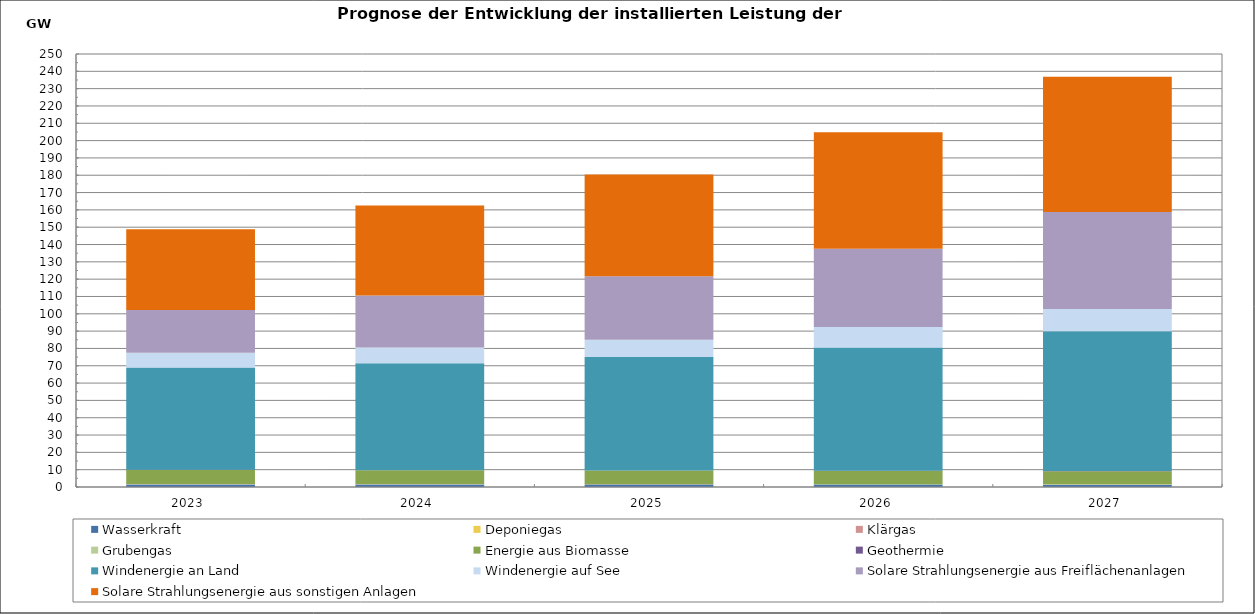
| Category | Wasserkraft | Deponiegas | Klärgas | Grubengas | Energie aus Biomasse | Geothermie | Windenergie an Land | Windenergie auf See | Solare Strahlungsenergie aus Freiflächenanlagen | Solare Strahlungsenergie aus sonstigen Anlagen |
|---|---|---|---|---|---|---|---|---|---|---|
| 2023.0 | 1424.26 | 79.153 | 66.397 | 133.631 | 8157.264 | 58.252 | 59010.05 | 8625.818 | 24583.586 | 46656.818 |
| 2024.0 | 1410.662 | 77.402 | 66.997 | 125.491 | 7979.979 | 70.252 | 61745.439 | 9093.818 | 29953.874 | 51990.753 |
| 2025.0 | 1395.865 | 73.826 | 67.397 | 118.701 | 7801.287 | 82.252 | 65488.589 | 9993.818 | 36670.302 | 58751.541 |
| 2026.0 | 1381.897 | 60.764 | 67.997 | 116.001 | 7620.241 | 94.252 | 71160.78 | 11851.818 | 45229.405 | 67297.146 |
| 2027.0 | 1367.628 | 58.962 | 68.397 | 98.001 | 7494.239 | 110.252 | 80728.604 | 12781.818 | 56074.72 | 78120.531 |